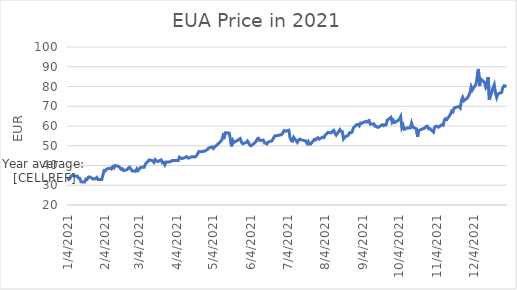
| Category | Price |
|---|---|
| 12/31/21 | 80.65 |
| 12/30/21 | 80.16 |
| 12/29/21 | 80.36 |
| 12/28/21 | 79.29 |
| 12/27/21 | 76.92 |
| 12/24/21 | 76.31 |
| 12/23/21 | 74.46 |
| 12/22/21 | 76.83 |
| 12/21/21 | 80.94 |
| 12/20/21 | 79.38 |
| 12/17/21 | 73.28 |
| 12/16/21 | 84.77 |
| 12/15/21 | 80.5 |
| 12/14/21 | 79.48 |
| 12/13/21 | 82.12 |
| 12/10/21 | 83.73 |
| 12/9/21 | 80.2 |
| 12/8/21 | 88.88 |
| 12/7/21 | 84.91 |
| 12/6/21 | 81.25 |
| 12/3/21 | 78.25 |
| 12/2/21 | 79.86 |
| 12/1/21 | 76.81 |
| 11/30/21 | 75.37 |
| 11/29/21 | 74.21 |
| 11/26/21 | 72.78 |
| 11/25/21 | 74.46 |
| 11/24/21 | 72.91 |
| 11/23/21 | 69.17 |
| 11/22/21 | 69.91 |
| 11/19/21 | 69.36 |
| 11/18/21 | 69.1 |
| 11/17/21 | 67.16 |
| 11/16/21 | 67.55 |
| 11/15/21 | 65.93 |
| 11/12/21 | 63.27 |
| 11/11/21 | 63.7 |
| 11/10/21 | 63.16 |
| 11/9/21 | 60.41 |
| 11/8/21 | 60.63 |
| 11/5/21 | 59.39 |
| 11/4/21 | 59.86 |
| 11/3/21 | 59.82 |
| 11/2/21 | 59.46 |
| 11/1/21 | 56.94 |
| 10/29/21 | 58.71 |
| 10/28/21 | 58.57 |
| 10/27/21 | 59.9 |
| 10/26/21 | 59.81 |
| 10/25/21 | 58.99 |
| 10/22/21 | 58.27 |
| 10/21/21 | 57.98 |
| 10/20/21 | 57.78 |
| 10/19/21 | 54.55 |
| 10/18/21 | 58.56 |
| 10/15/21 | 59.44 |
| 10/14/21 | 61.44 |
| 10/13/21 | 59.07 |
| 10/12/21 | 58.93 |
| 10/11/21 | 59.15 |
| 10/8/21 | 58.33 |
| 10/7/21 | 60.37 |
| 10/6/21 | 59.12 |
| 10/5/21 | 64.72 |
| 10/4/21 | 63.4 |
| 10/1/21 | 62.04 |
| 9/30/21 | 61.74 |
| 9/29/21 | 62.88 |
| 9/28/21 | 61.92 |
| 9/27/21 | 64.37 |
| 9/24/21 | 62.94 |
| 9/23/21 | 60.54 |
| 9/22/21 | 60.6 |
| 9/21/21 | 60.16 |
| 9/20/21 | 60.68 |
| 9/17/21 | 59.48 |
| 9/16/21 | 59.31 |
| 9/15/21 | 59.86 |
| 9/14/21 | 59.85 |
| 9/13/21 | 61.07 |
| 9/10/21 | 60.92 |
| 9/9/21 | 62.75 |
| 9/8/21 | 62.45 |
| 9/7/21 | 61.99 |
| 9/6/21 | 62.31 |
| 9/3/21 | 61.32 |
| 9/2/21 | 61.52 |
| 9/1/21 | 60.12 |
| 8/31/21 | 60.76 |
| 8/30/21 | 60.76 |
| 8/27/21 | 59 |
| 8/26/21 | 56.86 |
| 8/25/21 | 56.54 |
| 8/24/21 | 56.64 |
| 8/23/21 | 55.34 |
| 8/20/21 | 54.38 |
| 8/19/21 | 53.5 |
| 8/18/21 | 57.13 |
| 8/17/21 | 57.23 |
| 8/16/21 | 58.16 |
| 8/13/21 | 55.38 |
| 8/12/21 | 56.26 |
| 8/11/21 | 57.78 |
| 8/10/21 | 57.41 |
| 8/9/21 | 56.62 |
| 8/6/21 | 56.66 |
| 8/5/21 | 55.98 |
| 8/4/21 | 55.46 |
| 8/3/21 | 54.19 |
| 8/2/21 | 54.43 |
| 7/30/21 | 53.33 |
| 7/29/21 | 54.05 |
| 7/28/21 | 53.84 |
| 7/27/21 | 52.91 |
| 7/26/21 | 53.2 |
| 7/23/21 | 50.89 |
| 7/22/21 | 50.79 |
| 7/21/21 | 52.14 |
| 7/20/21 | 51.21 |
| 7/19/21 | 52.41 |
| 7/16/21 | 52.89 |
| 7/15/21 | 52.97 |
| 7/14/21 | 53.37 |
| 7/13/21 | 52.85 |
| 7/12/21 | 51.71 |
| 7/9/21 | 54.26 |
| 7/8/21 | 52.35 |
| 7/7/21 | 52.62 |
| 7/6/21 | 54.02 |
| 7/5/21 | 57.87 |
| 7/2/21 | 57.35 |
| 7/1/21 | 57.65 |
| 6/30/21 | 56.37 |
| 6/29/21 | 55.64 |
| 6/28/21 | 55.5 |
| 6/25/21 | 55.05 |
| 6/24/21 | 55.09 |
| 6/23/21 | 54.67 |
| 6/22/21 | 53.41 |
| 6/21/21 | 52.42 |
| 6/18/21 | 51.9 |
| 6/17/21 | 50.91 |
| 6/16/21 | 51.34 |
| 6/15/21 | 51.4 |
| 6/14/21 | 52.9 |
| 6/11/21 | 52.67 |
| 6/10/21 | 53.78 |
| 6/9/21 | 53.51 |
| 6/8/21 | 52.17 |
| 6/7/21 | 51.47 |
| 6/4/21 | 49.97 |
| 6/3/21 | 50.24 |
| 6/2/21 | 51.4 |
| 6/1/21 | 52.41 |
| 5/31/21 | 51.7 |
| 5/28/21 | 51.03 |
| 5/27/21 | 51.84 |
| 5/26/21 | 53.67 |
| 5/25/21 | 53.32 |
| 5/24/21 | 52.77 |
| 5/21/21 | 51.75 |
| 5/20/21 | 52.7 |
| 5/19/21 | 49.68 |
| 5/18/21 | 53.07 |
| 5/17/21 | 56.34 |
| 5/14/21 | 56.65 |
| 5/13/21 | 54.49 |
| 5/12/21 | 55.32 |
| 5/11/21 | 53.04 |
| 5/10/21 | 52.22 |
| 5/7/21 | 50.45 |
| 5/6/21 | 49.94 |
| 5/5/21 | 49.45 |
| 5/4/21 | 48.61 |
| 5/3/21 | 49.42 |
| 4/30/21 | 48.84 |
| 4/29/21 | 48.02 |
| 4/28/21 | 47.79 |
| 4/27/21 | 47.3 |
| 4/26/21 | 47.2 |
| 4/23/21 | 46.95 |
| 4/22/21 | 47.09 |
| 4/21/21 | 45.91 |
| 4/20/21 | 44.89 |
| 4/19/21 | 44.35 |
| 4/16/21 | 44.42 |
| 4/15/21 | 44.16 |
| 4/14/21 | 43.82 |
| 4/13/21 | 43.85 |
| 4/12/21 | 44.48 |
| 4/9/21 | 43.64 |
| 4/8/21 | 43.48 |
| 4/7/21 | 43.86 |
| 4/6/21 | 44.24 |
| 4/5/21 | 42.47 |
| 4/1/21 | 42.47 |
| 3/31/21 | 42.55 |
| 3/30/21 | 42.05 |
| 3/29/21 | 41.85 |
| 3/26/21 | 41.73 |
| 3/25/21 | 40.35 |
| 3/24/21 | 41.6 |
| 3/23/21 | 41.43 |
| 3/22/21 | 42.84 |
| 3/19/21 | 41.97 |
| 3/18/21 | 42.4 |
| 3/17/21 | 42.99 |
| 3/16/21 | 41.6 |
| 3/15/21 | 42.39 |
| 3/12/21 | 42.85 |
| 3/11/21 | 41.93 |
| 3/10/21 | 41.54 |
| 3/9/21 | 40.65 |
| 3/8/21 | 39.13 |
| 3/5/21 | 39.02 |
| 3/4/21 | 38.16 |
| 3/3/21 | 37.47 |
| 3/2/21 | 38.35 |
| 3/1/21 | 37.13 |
| 2/26/21 | 37.28 |
| 2/25/21 | 38.26 |
| 2/24/21 | 39.15 |
| 2/23/21 | 38.67 |
| 2/22/21 | 37.96 |
| 2/19/21 | 37.4 |
| 2/18/21 | 38.32 |
| 2/17/21 | 38.09 |
| 2/16/21 | 38.86 |
| 2/15/21 | 39.52 |
| 2/12/21 | 40.02 |
| 2/11/21 | 38.76 |
| 2/10/21 | 39.33 |
| 2/9/21 | 38.26 |
| 2/8/21 | 38.61 |
| 2/5/21 | 38.2 |
| 2/4/21 | 37.27 |
| 2/3/21 | 37.43 |
| 2/2/21 | 34.97 |
| 2/1/21 | 32.85 |
| 1/29/21 | 32.95 |
| 1/28/21 | 33.95 |
| 1/27/21 | 33.28 |
| 1/26/21 | 33.35 |
| 1/25/21 | 33.16 |
| 1/22/21 | 34.24 |
| 1/21/21 | 34.11 |
| 1/20/21 | 32.91 |
| 1/19/21 | 33.09 |
| 1/18/21 | 31.62 |
| 1/15/21 | 31.74 |
| 1/14/21 | 33.53 |
| 1/13/21 | 33.65 |
| 1/12/21 | 34.66 |
| 1/11/21 | 34.53 |
| 1/8/21 | 34.92 |
| 1/7/21 | 34.76 |
| 1/6/21 | 33.63 |
| 1/5/21 | 32.96 |
| 1/4/21 | 33.69 |